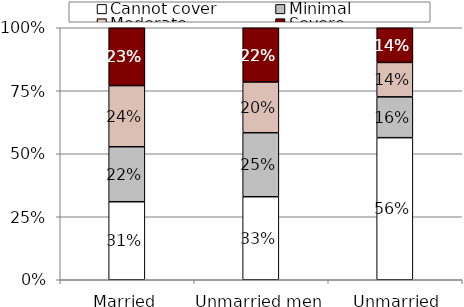
| Category | Cannot cover | Minimal | Moderate | Severe |
|---|---|---|---|---|
| Married | 0.31 | 0.218 | 0.243 | 0.23 |
| Unmarried men | 0.329 | 0.254 | 0.201 | 0.215 |
| Unmarried women | 0.564 | 0.162 | 0.137 | 0.138 |